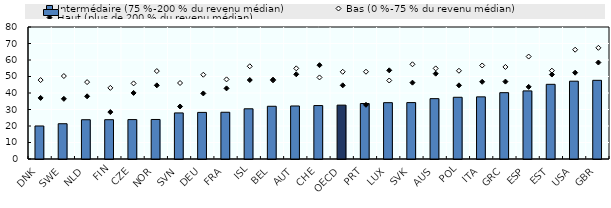
| Category | Intermédaire (75 %-200 % du revenu médian) |
|---|---|
| DNK | 20.017 |
| SWE | 21.383 |
| NLD | 23.803 |
| FIN | 23.82 |
| CZE | 23.887 |
| NOR | 23.958 |
| SVN | 27.919 |
| DEU | 28.246 |
| FRA | 28.328 |
| ISL | 30.429 |
| BEL | 31.957 |
| AUT | 32.135 |
| CHE | 32.39 |
| OECD | 32.644 |
| PRT | 33.628 |
| LUX | 34.139 |
| SVK | 34.192 |
| AUS | 36.577 |
| POL | 37.406 |
| ITA | 37.666 |
| GRC | 40.205 |
| ESP | 41.277 |
| EST | 45.263 |
| USA | 47.15 |
| GBR | 47.683 |